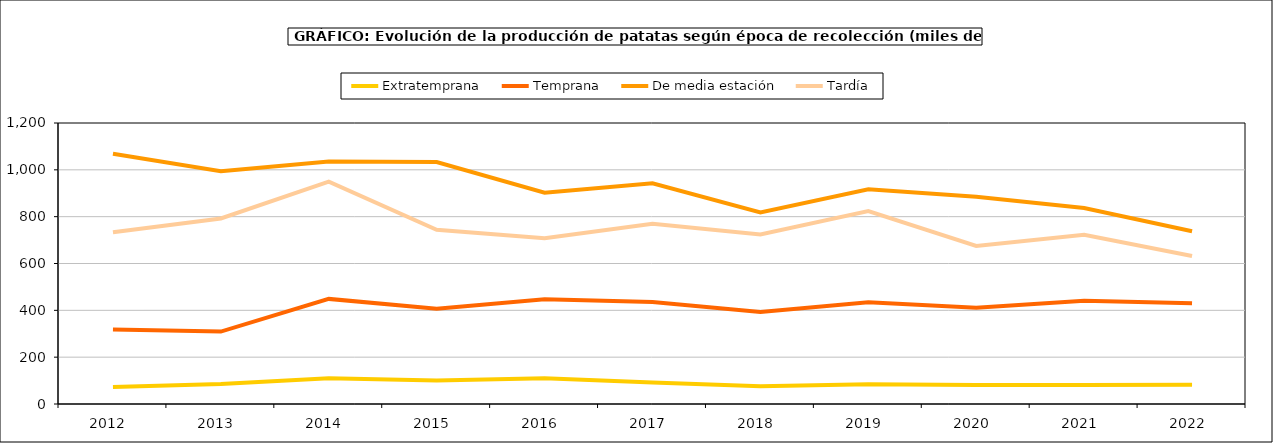
| Category | Extratemprana | Temprana | De media estación | Tardía |
|---|---|---|---|---|
| 2012.0 | 72.219 | 318.279 | 1068.752 | 733.034 |
| 2013.0 | 85.916 | 309.356 | 994.291 | 792.519 |
| 2014.0 | 109.861 | 448.841 | 1035.787 | 949.52 |
| 2015.0 | 100.12 | 407.098 | 1032.991 | 743.864 |
| 2016.0 | 109.713 | 447.057 | 902.038 | 707.396 |
| 2017.0 | 92.094 | 435.374 | 942.171 | 769.831 |
| 2018.0 | 76.034 | 392.675 | 818.353 | 723.871 |
| 2019.0 | 84.367 | 434.185 | 917.139 | 823.629 |
| 2020.0 | 81.156 | 410.992 | 884.716 | 674.969 |
| 2021.0 | 80.901 | 440.74 | 836.738 | 722.727 |
| 2022.0 | 82.256 | 429.972 | 737.413 | 632.279 |